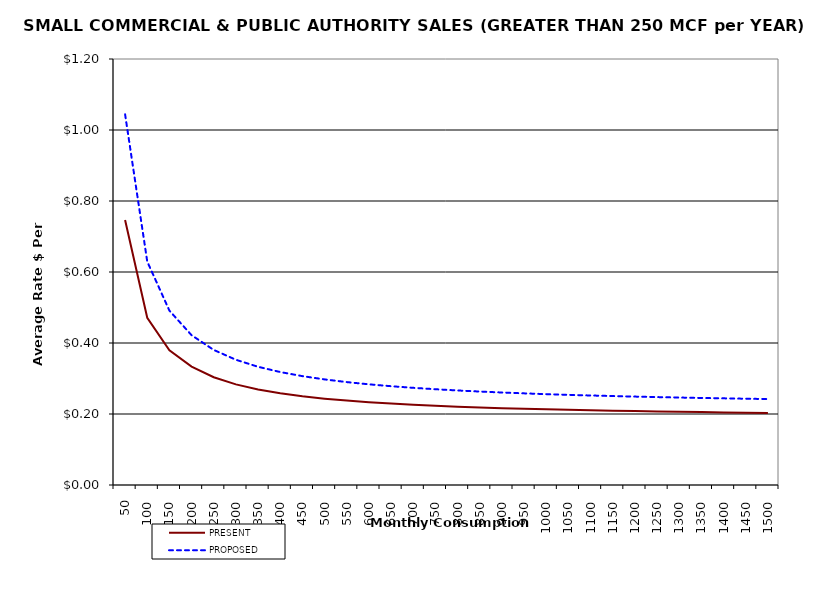
| Category | PRESENT | PROPOSED |
|---|---|---|
| 50.0 | 0.747 | 1.044 |
| 100.0 | 0.471 | 0.629 |
| 150.0 | 0.379 | 0.491 |
| 200.0 | 0.334 | 0.422 |
| 250.0 | 0.303 | 0.38 |
| 300.0 | 0.283 | 0.353 |
| 350.0 | 0.269 | 0.333 |
| 400.0 | 0.258 | 0.318 |
| 450.0 | 0.25 | 0.307 |
| 500.0 | 0.243 | 0.297 |
| 550.0 | 0.238 | 0.29 |
| 600.0 | 0.233 | 0.284 |
| 650.0 | 0.229 | 0.278 |
| 700.0 | 0.226 | 0.274 |
| 750.0 | 0.223 | 0.27 |
| 800.0 | 0.221 | 0.266 |
| 850.0 | 0.218 | 0.263 |
| 900.0 | 0.217 | 0.261 |
| 950.0 | 0.215 | 0.258 |
| 1000.0 | 0.213 | 0.256 |
| 1050.0 | 0.212 | 0.254 |
| 1100.0 | 0.21 | 0.252 |
| 1150.0 | 0.209 | 0.251 |
| 1200.0 | 0.208 | 0.249 |
| 1250.0 | 0.207 | 0.248 |
| 1300.0 | 0.206 | 0.246 |
| 1350.0 | 0.205 | 0.245 |
| 1400.0 | 0.205 | 0.244 |
| 1450.0 | 0.204 | 0.243 |
| 1500.0 | 0.203 | 0.242 |